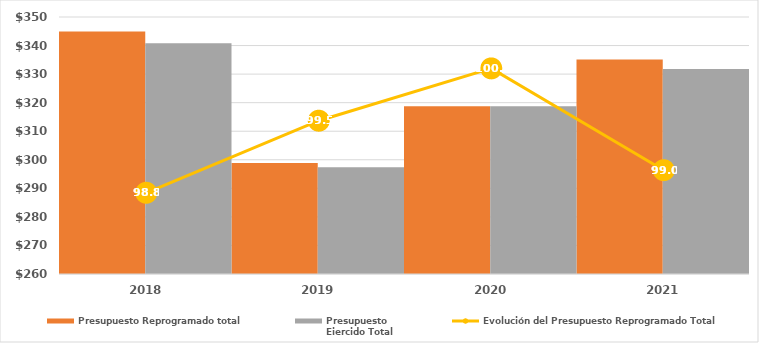
| Category | Presupuesto Reprogramado total | Presupuesto
Ejercido Total |
|---|---|---|
| 2018.0 | 344938.7 | 340765 |
| 2019.0 | 298904.428 | 297383.7 |
| 2020.0 | 318785.247 | 318785.247 |
| 2021.0 | 335107.39 | 331789.211 |